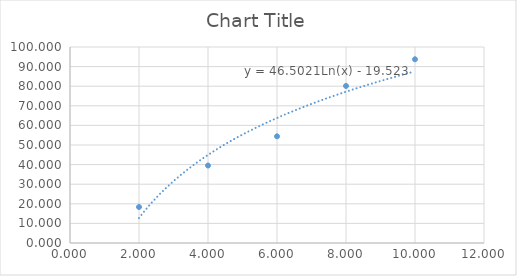
| Category | Series 0 |
|---|---|
| 2.0 | 18.359 |
| 4.0 | 39.525 |
| 6.0 | 54.428 |
| 8.0 | 80.13 |
| 10.0 | 93.737 |